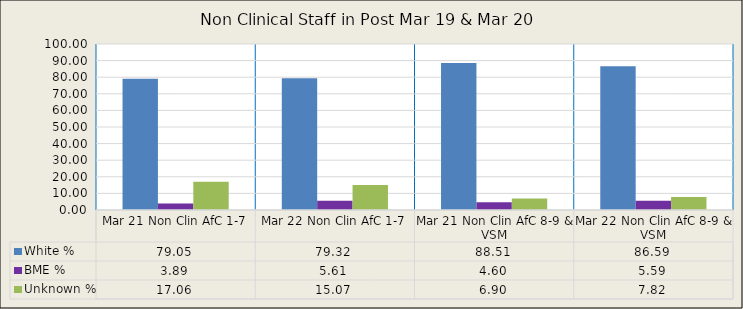
| Category | White % | BME % | Unknown % |
|---|---|---|---|
| Mar 21 Non Clin AfC 1-7 | 79.05 | 3.888 | 17.063 |
| Mar 22 Non Clin AfC 1-7 | 79.318 | 5.611 | 15.072 |
| Mar 21 Non Clin AfC 8-9 & VSM | 88.506 | 4.598 | 6.897 |
| Mar 22 Non Clin AfC 8-9 & VSM | 86.592 | 5.587 | 7.821 |